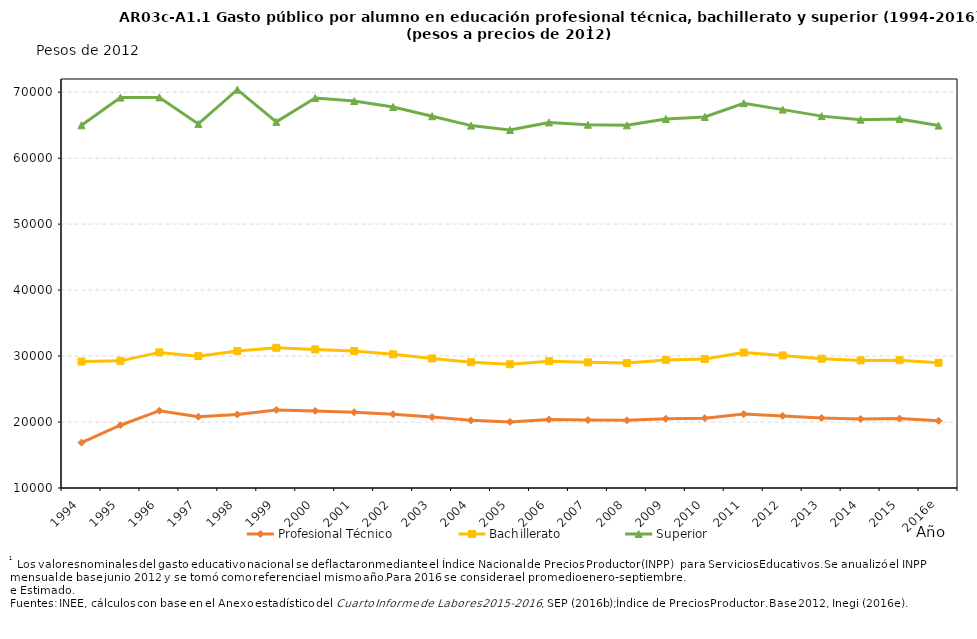
| Category | Profesional Técnico | Bachillerato | Superior |
|---|---|---|---|
| 1994 | 16884.824 | 29164.697 | 64980.99 |
| 1995 | 19513.925 | 29270.888 | 69185.734 |
| 1996 | 21720.479 | 30555.928 | 69211.017 |
| 1997 | 20810.403 | 29991.464 | 65185.529 |
| 1998 | 21140.68 | 30774.408 | 70379.732 |
| 1999 | 21833.73 | 31256.708 | 65501.189 |
| 2000 | 21686.101 | 31009.098 | 69111.78 |
| 2001 | 21489.001 | 30776.62 | 68655.538 |
| 2002 | 21186.823 | 30266.89 | 67764.203 |
| 2003 | 20746.255 | 29637.056 | 66354.234 |
| 2004 | 20253.502 | 29065.072 | 64933.938 |
| 2005 | 20013.522 | 28751.821 | 64268.776 |
| 2006 | 20375.586 | 29222.88 | 65416.354 |
| 2007 | 20293.08 | 29044.471 | 65064.688 |
| 2008 | 20253.87 | 28934.1 | 64981.165 |
| 2009 | 20490.827 | 29419.791 | 65936.963 |
| 2010 | 20588.364 | 29568.395 | 66255.107 |
| 2011 | 21201.411 | 30542.626 | 68327.318 |
| 2012 | 20925.56 | 30092.948 | 67360.374 |
| 2013 | 20611.046 | 29592.923 | 66371.348 |
| 2014 | 20466.178 | 29340.892 | 65835.89 |
| 2015 | 20521.271 | 29378.743 | 65948.701 |
| 2016e | 20194.217 | 28992.528 | 64939.911 |